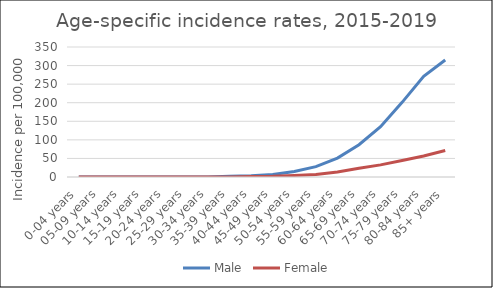
| Category | Male | Female |
|---|---|---|
| 0-04 years | 0 | 0 |
| 05-09 years | 0 | 0 |
| 10-14 years | 0 | 0 |
| 15-19 years | 0 | 0 |
| 20-24 years | 0 | 0 |
| 25-29 years | 0 | 0 |
| 30-34 years | 0 | 0 |
| 35-39 years | 1.72 | 0 |
| 40-44 years | 3.28 | 1.28 |
| 45-49 years | 7.03 | 1.89 |
| 50-54 years | 14.92 | 4.05 |
| 55-59 years | 27.85 | 6.99 |
| 60-64 years | 50.89 | 13.3 |
| 65-69 years | 86.89 | 23.58 |
| 70-74 years | 135.57 | 32.69 |
| 75-79 years | 201.03 | 44.28 |
| 80-84 years | 271.21 | 56.47 |
| 85+ years | 314.83 | 71.46 |